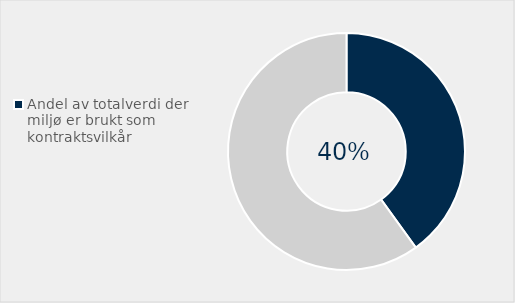
| Category | Series 0 |
|---|---|
| Andel av totalverdi der miljø er brukt som kontraktsvilkår | 0.401 |
| Ikke brukt miljø som kontraktsvilkår | 0.599 |